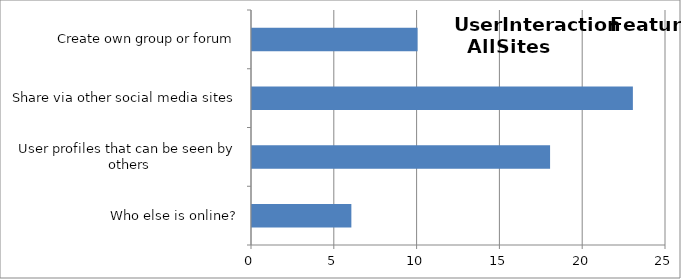
| Category | Series 0 |
|---|---|
| Who else is online? | 6 |
| User profiles that can be seen by others | 18 |
| Share via other social media sites | 23 |
| Create own group or forum | 10 |